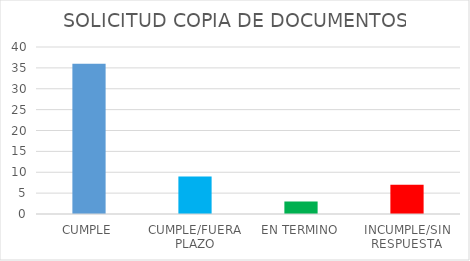
| Category | TOTAL |
|---|---|
| CUMPLE | 36 |
| CUMPLE/FUERA PLAZO | 9 |
| EN TERMINO | 3 |
| INCUMPLE/SIN RESPUESTA | 7 |